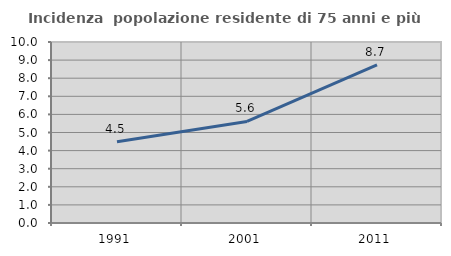
| Category | Incidenza  popolazione residente di 75 anni e più |
|---|---|
| 1991.0 | 4.492 |
| 2001.0 | 5.609 |
| 2011.0 | 8.733 |